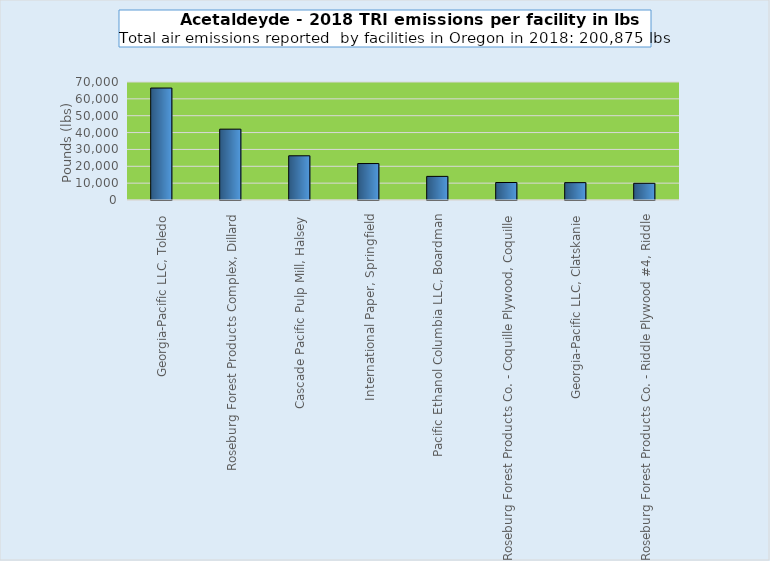
| Category | Series 0 |
|---|---|
| Georgia-Pacific LLC, Toledo | 66413 |
| Roseburg Forest Products Complex, Dillard | 42023 |
| Cascade Pacific Pulp Mill, Halsey | 26224 |
| International Paper, Springfield | 21620 |
| Pacific Ethanol Columbia LLC, Boardman | 14009 |
| Roseburg Forest Products Co. - Coquille Plywood, Coquille | 10381 |
| Georgia-Pacific LLC, Clatskanie | 10300 |
| Roseburg Forest Products Co. - Riddle Plywood #4, Riddle | 9905 |